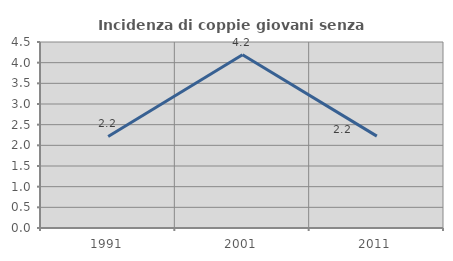
| Category | Incidenza di coppie giovani senza figli |
|---|---|
| 1991.0 | 2.214 |
| 2001.0 | 4.194 |
| 2011.0 | 2.222 |